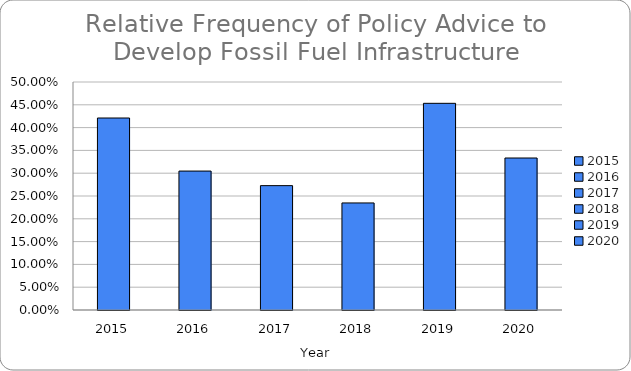
| Category | Develop Fossil Fuel Infrastructure |
|---|---|
| 2015.0 | 0.421 |
| 2016.0 | 0.305 |
| 2017.0 | 0.273 |
| 2018.0 | 0.235 |
| 2019.0 | 0.453 |
| 2020.0 | 0.333 |